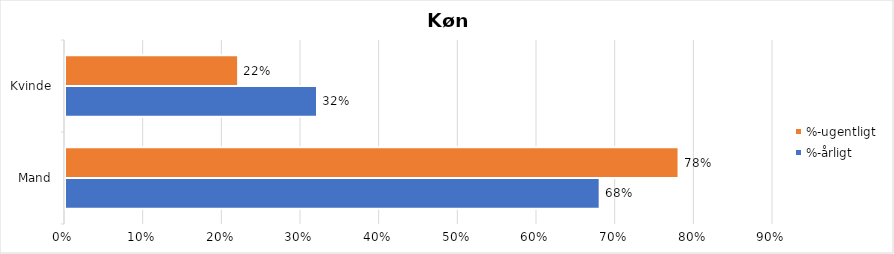
| Category | %-årligt | %-ugentligt |
|---|---|---|
| Mand | 0.68 | 0.78 |
| Kvinde | 0.32 | 0.22 |